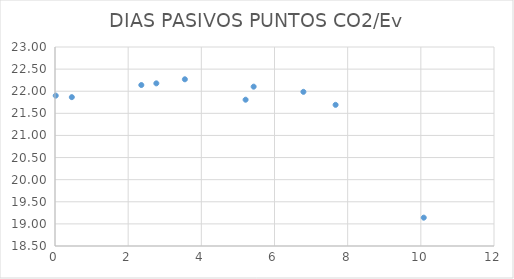
| Category | Series 0 |
|---|---|
| 0.01999999999999602 | 21.9 |
| 0.46000000000000085 | 21.866 |
| 7.669999999999995 | 21.692 |
| 2.769999999999996 | 22.178 |
| 5.210000000000001 | 21.808 |
| 3.5500000000000007 | 22.27 |
| 6.789999999999999 | 21.986 |
| 5.43 | 22.103 |
| 2.3599999999999994 | 22.14 |
| 10.079999999999998 | 19.141 |